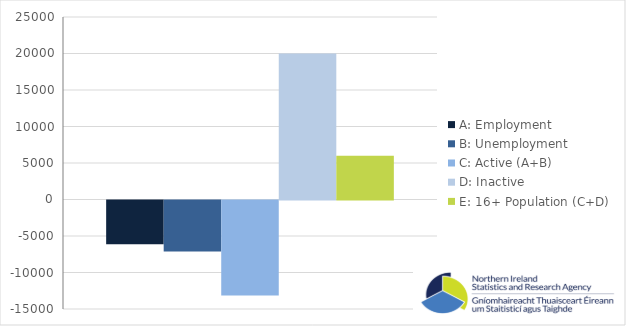
| Category | A: Employment | B: Unemployment | C: Active (A+B) | D: Inactive | E: 16+ Population (C+D) |
|---|---|---|---|---|---|
| 0 | -6000 | -7000 | -13000 | 20000 | 6000 |